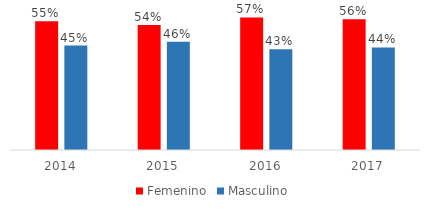
| Category | Femenino | Masculino |
|---|---|---|
| 2014.0 | 0.552 | 0.448 |
| 2015.0 | 0.536 | 0.464 |
| 2016.0 | 0.568 | 0.432 |
| 2017.0 | 0.561 | 0.439 |